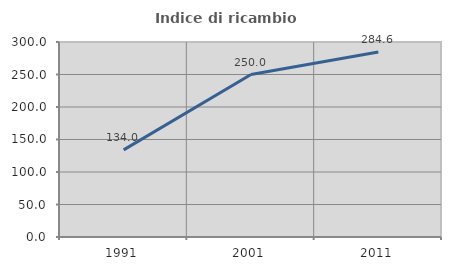
| Category | Indice di ricambio occupazionale  |
|---|---|
| 1991.0 | 134.043 |
| 2001.0 | 250 |
| 2011.0 | 284.615 |